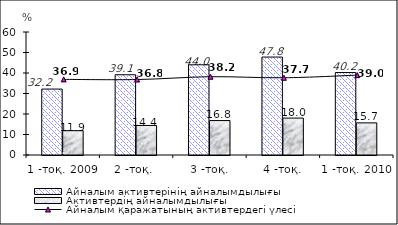
| Category | Айналым активтерінің айналымдылығы | Активтердің айналымдылығы |
|---|---|---|
| 1 -тоқ. 2009 | 32.164 | 11.864 |
| 2 -тоқ.  | 39.148 | 14.41 |
| 3 -тоқ. | 43.995 | 16.801 |
| 4 -тоқ. | 47.782 | 18.003 |
| 1 -тоқ. 2010  | 40.229 | 15.675 |